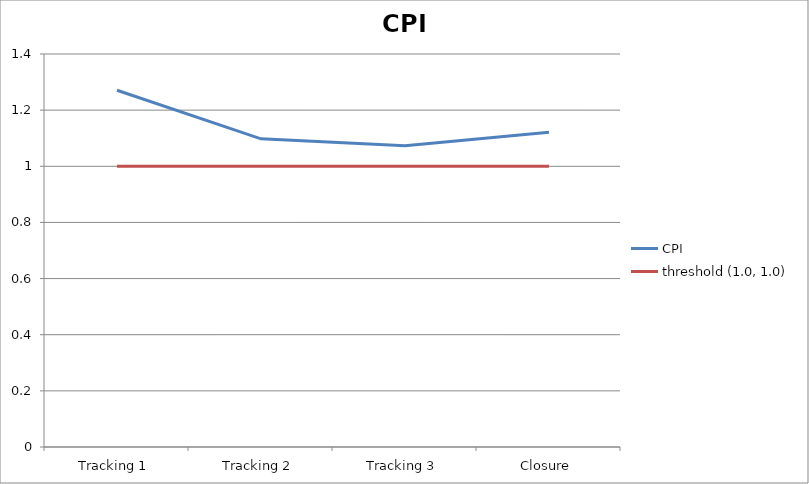
| Category | CPI | threshold (1.0, 1.0) |
|---|---|---|
| Tracking 1 | 1.271 | 1 |
| Tracking 2 | 1.098 | 1 |
| Tracking 3 | 1.073 | 1 |
| Closure | 1.121 | 1 |